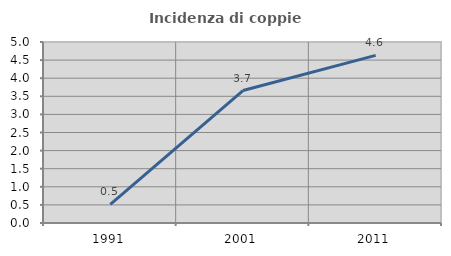
| Category | Incidenza di coppie miste |
|---|---|
| 1991.0 | 0.517 |
| 2001.0 | 3.659 |
| 2011.0 | 4.63 |